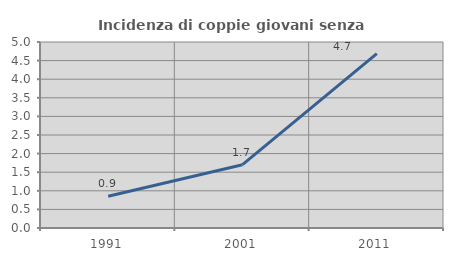
| Category | Incidenza di coppie giovani senza figli |
|---|---|
| 1991.0 | 0.855 |
| 2001.0 | 1.702 |
| 2011.0 | 4.688 |